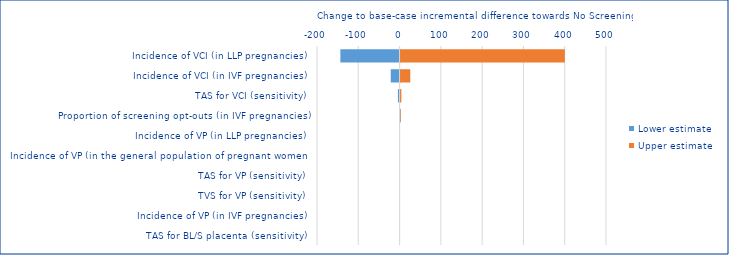
| Category | Lower estimate | Upper estimate |
|---|---|---|
| Incidence of VCI (in LLP pregnancies) | -143.426 | 397.855 |
| Incidence of VCI (in IVF pregnancies) | -21.378 | 23.526 |
| TAS for VCI (sensitivity) | -3.955 | 1.936 |
| Proportion of screening opt-outs (in IVF pregnancies) | 0.036 | -0.207 |
| Incidence of VP (in LLP pregnancies) | 0 | 0 |
| Incidence of VP (in the general population of pregnant women) | 0 | 0 |
| TAS for VP (sensitivity) | 0 | 0 |
| TVS for VP (sensitivity) | 0 | 0 |
| Incidence of VP (in IVF pregnancies) | 0 | 0 |
| TAS for BL/S placenta (sensitivity) | 0 | 0 |